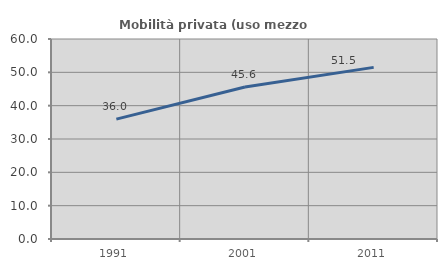
| Category | Mobilità privata (uso mezzo privato) |
|---|---|
| 1991.0 | 35.955 |
| 2001.0 | 45.588 |
| 2011.0 | 51.485 |